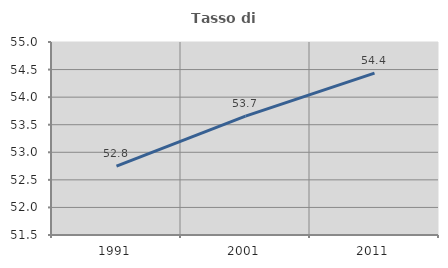
| Category | Tasso di occupazione   |
|---|---|
| 1991.0 | 52.75 |
| 2001.0 | 53.655 |
| 2011.0 | 54.435 |